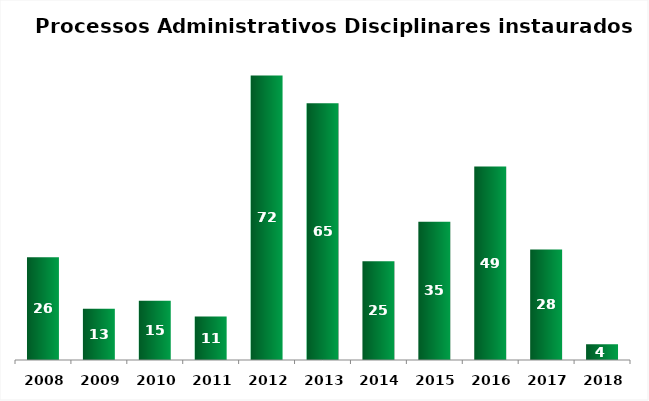
| Category | Qtde de processos |
|---|---|
| 2008.0 | 26 |
| 2009.0 | 13 |
| 2010.0 | 15 |
| 2011.0 | 11 |
| 2012.0 | 72 |
| 2013.0 | 65 |
| 2014.0 | 25 |
| 2015.0 | 35 |
| 2016.0 | 49 |
| 2017.0 | 28 |
| 2018.0 | 4 |